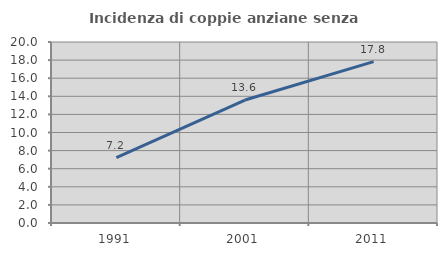
| Category | Incidenza di coppie anziane senza figli  |
|---|---|
| 1991.0 | 7.224 |
| 2001.0 | 13.585 |
| 2011.0 | 17.829 |